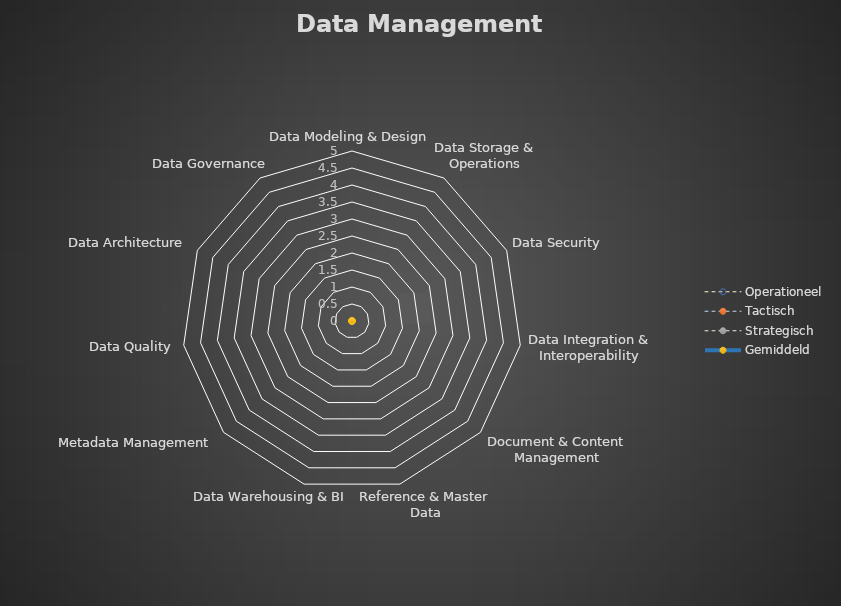
| Category | Operationeel | Tactisch | Strategisch | Gemiddeld |
|---|---|---|---|---|
| Data Modeling & Design | 0 | 0 | 0 | 0 |
| Data Storage & Operations | 0 | 0 | 0 | 0 |
| Data Security | 0 | 0 | 0 | 0 |
| Data Integration & Interoperability | 0 | 0 | 0 | 0 |
| Document & Content Management | 0 | 0 | 0 | 0 |
| Reference & Master Data | 0 | 0 | 0 | 0 |
| Data Warehousing & BI | 0 | 0 | 0 | 0 |
| Metadata Management | 0 | 0 | 0 | 0 |
| Data Quality | 0 | 0 | 0 | 0 |
| Data Architecture | 0 | 0 | 0 | 0 |
| Data Governance | 0 | 0 | 0 | 0 |